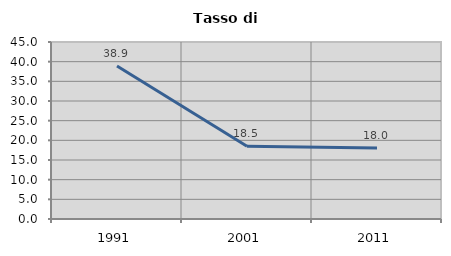
| Category | Tasso di disoccupazione   |
|---|---|
| 1991.0 | 38.889 |
| 2001.0 | 18.519 |
| 2011.0 | 18.033 |